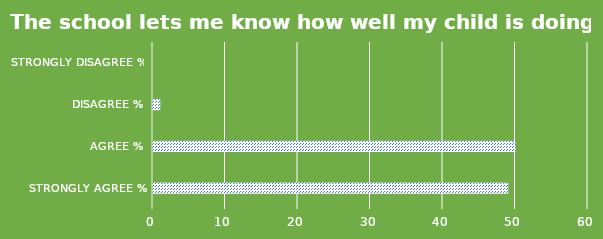
| Category | Series 1 |
|---|---|
| Strongly agree % | 49 |
| Agree % | 50 |
| Disagree % | 1 |
| Strongly disagree % | 0 |